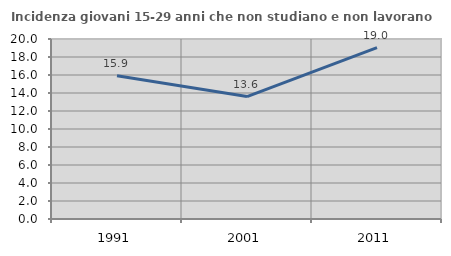
| Category | Incidenza giovani 15-29 anni che non studiano e non lavorano  |
|---|---|
| 1991.0 | 15.927 |
| 2001.0 | 13.605 |
| 2011.0 | 19.048 |